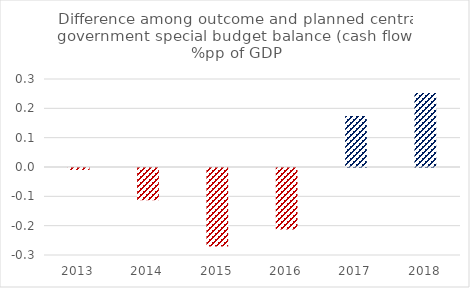
| Category | Series 0 |
|---|---|
| 2013.0 | -0.007 |
| 2014.0 | -0.11 |
| 2015.0 | -0.267 |
| 2016.0 | -0.209 |
| 2017.0 | 0.174 |
| 2018.0 | 0.252 |